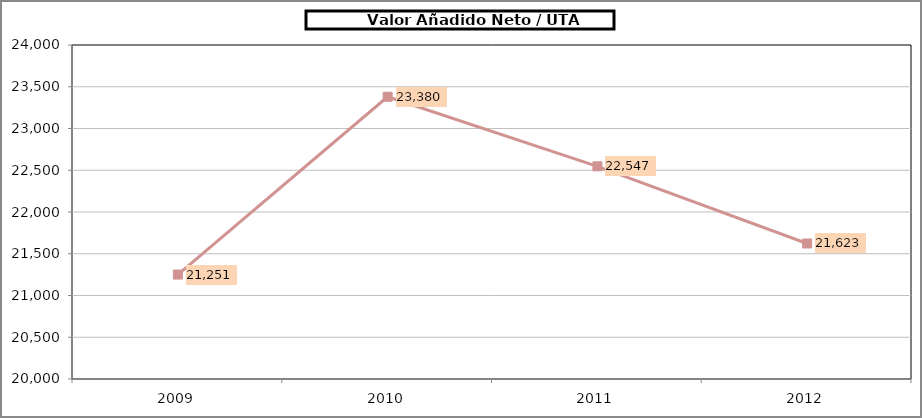
| Category |      Valor Añadido Neto / UTA (euros/UTA) |
|---|---|
| 2009.0 | 21250.865 |
| 2010.0 | 23379.786 |
| 2011.0 | 22546.842 |
| 2012.0 | 21623.058 |